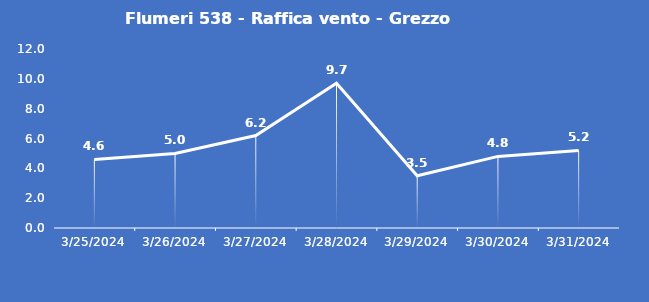
| Category | Flumeri 538 - Raffica vento - Grezzo (m/s) |
|---|---|
| 3/25/24 | 4.6 |
| 3/26/24 | 5 |
| 3/27/24 | 6.2 |
| 3/28/24 | 9.7 |
| 3/29/24 | 3.5 |
| 3/30/24 | 4.8 |
| 3/31/24 | 5.2 |